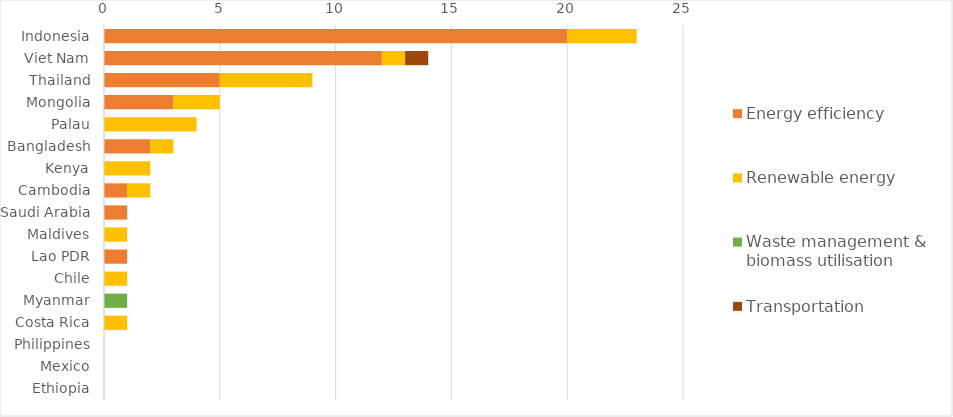
| Category | Energy efficiency | Renewable energy | Waste management & biomass utilisation | Transportation |
|---|---|---|---|---|
| Indonesia | 20 | 3 | 0 | 0 |
| Viet Nam | 12 | 1 | 0 | 1 |
| Thailand | 5 | 4 | 0 | 0 |
| Mongolia | 3 | 2 | 0 | 0 |
| Palau | 0 | 4 | 0 | 0 |
| Bangladesh | 2 | 1 | 0 | 0 |
| Kenya | 0 | 2 | 0 | 0 |
| Cambodia | 1 | 1 | 0 | 0 |
| Saudi Arabia | 1 | 0 | 0 | 0 |
| Maldives | 0 | 1 | 0 | 0 |
| Lao PDR | 1 | 0 | 0 | 0 |
| Chile | 0 | 1 | 0 | 0 |
| Myanmar | 0 | 0 | 1 | 0 |
| Costa Rica | 0 | 1 | 0 | 0 |
| Philippines | 0 | 0 | 0 | 0 |
| Mexico | 0 | 0 | 0 | 0 |
| Ethiopia | 0 | 0 | 0 | 0 |